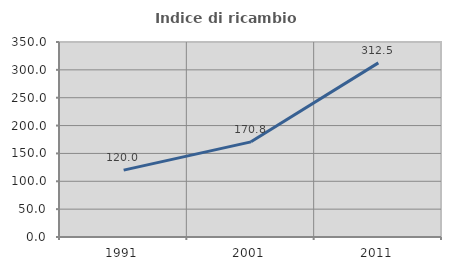
| Category | Indice di ricambio occupazionale  |
|---|---|
| 1991.0 | 120 |
| 2001.0 | 170.787 |
| 2011.0 | 312.5 |